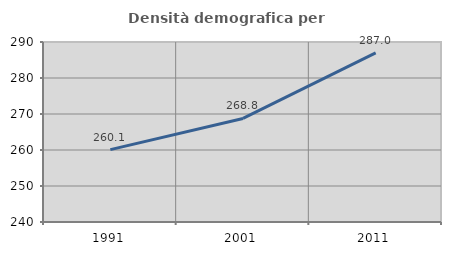
| Category | Densità demografica |
|---|---|
| 1991.0 | 260.1 |
| 2001.0 | 268.77 |
| 2011.0 | 286.985 |